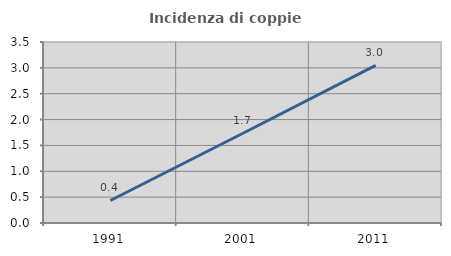
| Category | Incidenza di coppie miste |
|---|---|
| 1991.0 | 0.435 |
| 2001.0 | 1.736 |
| 2011.0 | 3.046 |